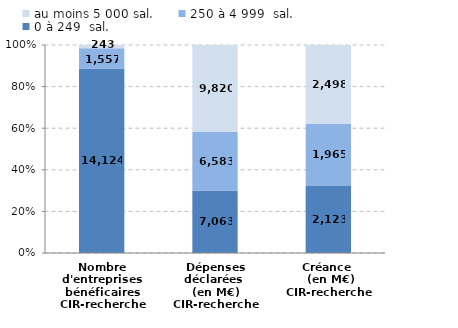
| Category | 0 à 249  sal. | 250 à 4 999  sal. | au moins 5 000 sal. |
|---|---|---|---|
| Nombre d'entreprises bénéficaires
CIR-recherche | 14124 | 1557 | 243 |
| Dépenses déclarées 
(en M€)
CIR-recherche | 7062.52 | 6582.71 | 9819.53 |
| Créance 
 (en M€)
CIR-recherche | 2122.87 | 1964.88 | 2497.72 |